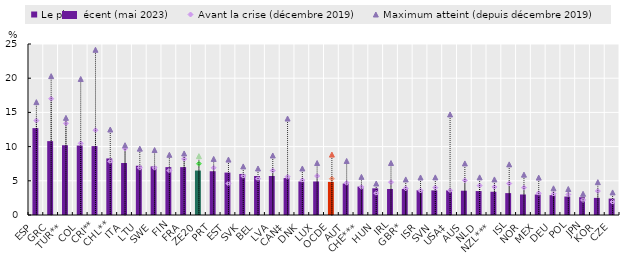
| Category | Le plus récent (mai 2023) |
|---|---|
| ESP | 12.7 |
| GRC | 10.8 |
| TUR** | 10.2 |
| COL | 10.154 |
| CRI** | 10.071 |
| CHL** | 8.269 |
| ITA | 7.6 |
| LTU | 7.2 |
| SWE | 7.1 |
| FIN | 7 |
| FRA | 7 |
| ZE20 | 6.5 |
| PRT | 6.4 |
| EST | 6.2 |
| SVK | 6 |
| BEL | 5.7 |
| LVA | 5.7 |
| CAN‡ | 5.4 |
| DNK | 4.9 |
| LUX | 4.9 |
| OCDE | 4.839 |
| AUT | 4.6 |
| CHE*** | 4.156 |
| HUN | 3.9 |
| IRL | 3.8 |
| GBR* | 3.8 |
| ISR | 3.63 |
| SVN | 3.6 |
| USA‡ | 3.6 |
| AUS | 3.551 |
| NLD | 3.5 |
| NZL*** | 3.4 |
| ISL | 3.2 |
| NOR | 3 |
| MEX | 2.992 |
| DEU | 2.9 |
| POL | 2.7 |
| JPN | 2.6 |
| KOR | 2.5 |
| CZE | 2.4 |